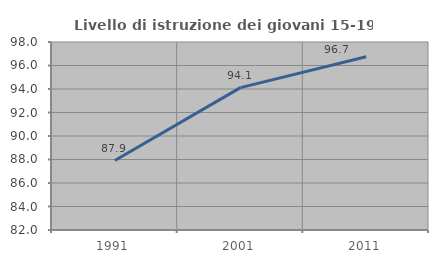
| Category | Livello di istruzione dei giovani 15-19 anni |
|---|---|
| 1991.0 | 87.912 |
| 2001.0 | 94.118 |
| 2011.0 | 96.739 |